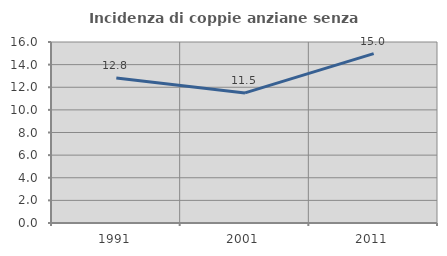
| Category | Incidenza di coppie anziane senza figli  |
|---|---|
| 1991.0 | 12.821 |
| 2001.0 | 11.5 |
| 2011.0 | 14.97 |